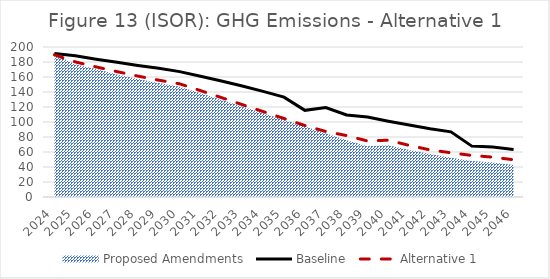
| Category | Baseline  | Alternative 1  |
|---|---|---|
| 2024.0 | 191.357 | 189.635 |
| 2025.0 | 188.439 | 180.126 |
| 2026.0 | 183.798 | 173.434 |
| 2027.0 | 179.753 | 167.162 |
| 2028.0 | 175.419 | 161.192 |
| 2029.0 | 171.532 | 155.766 |
| 2030.0 | 167.16 | 150.881 |
| 2031.0 | 161.031 | 141.837 |
| 2032.0 | 154.691 | 132.53 |
| 2033.0 | 148.038 | 123.157 |
| 2034.0 | 140.791 | 113.87 |
| 2035.0 | 133.188 | 104.682 |
| 2036.0 | 115.548 | 95.353 |
| 2037.0 | 119.355 | 87.351 |
| 2038.0 | 109.345 | 81.923 |
| 2039.0 | 106.623 | 74.696 |
| 2040.0 | 101.123 | 75.752 |
| 2041.0 | 95.876 | 68.796 |
| 2042.0 | 90.88 | 62.788 |
| 2043.0 | 86.822 | 58.99 |
| 2044.0 | 67.842 | 55.414 |
| 2045.0 | 66.703 | 53.133 |
| 2046.0 | 63.352 | 49.694 |